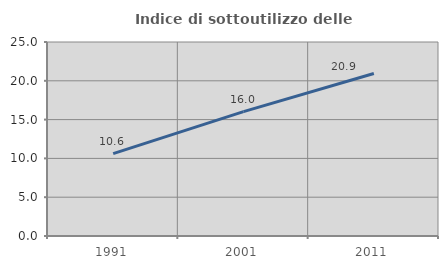
| Category | Indice di sottoutilizzo delle abitazioni  |
|---|---|
| 1991.0 | 10.609 |
| 2001.0 | 16.021 |
| 2011.0 | 20.934 |